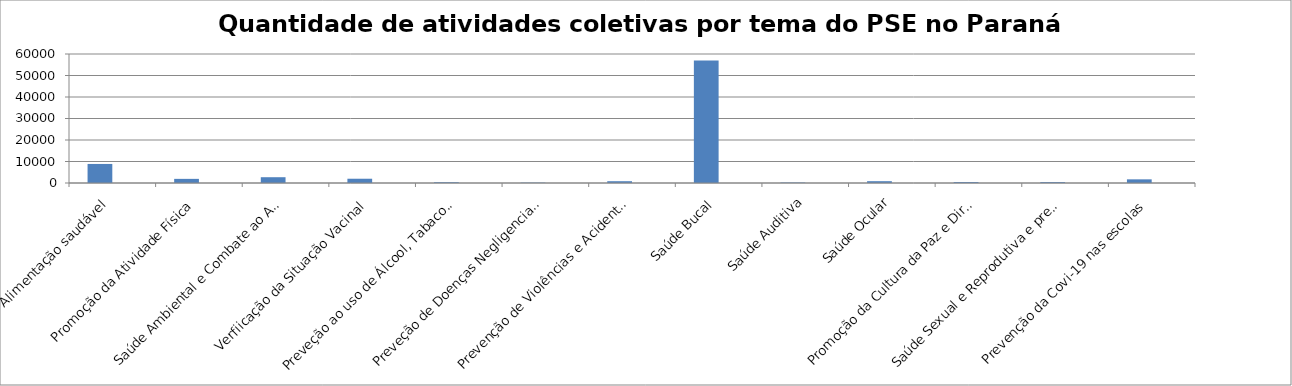
| Category | Series 0 | Series 1 |
|---|---|---|
| Alimentação saudável | 8862 |  |
| Promoção da Atividade Física | 1923 |  |
| Saúde Ambiental e Combate ao Aedes | 2694 |  |
| Verfiicação da Situação Vacinal  | 1986 |  |
| Preveção ao uso de Álcool, Tabaco e outras drogras | 351 |  |
| Preveção de Doenças Negligenciadas | 159 |  |
| Prevenção de Violências e Acidentes | 832 |  |
| Saúde Bucal | 56984 |  |
| Saúde Auditiva | 199 |  |
| Saúde Ocular | 844 |  |
| Promoção da Cultura da Paz e Direitos Humanos | 434 |  |
| Saúde Sexual e Reprodutiva e prevenção do HIV/AIDS | 419 |  |
| Prevenção da Covi-19 nas escolas | 1700 |  |